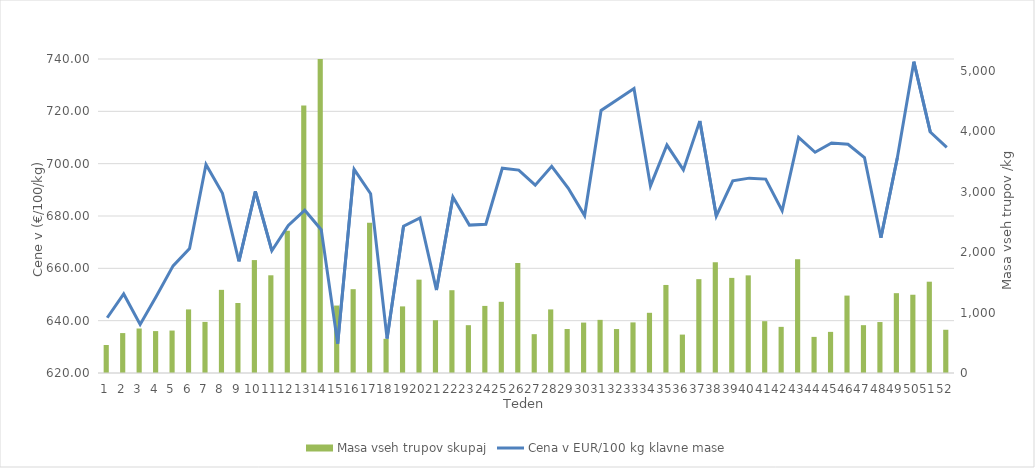
| Category | Masa vseh trupov skupaj |
|---|---|
| 0 | 464 |
| 1 | 661 |
| 2 | 737 |
| 3 | 694 |
| 4 | 703 |
| 5 | 1053 |
| 6 | 846 |
| 7 | 1377 |
| 8 | 1159 |
| 9 | 1870 |
| 10 | 1618 |
| 11 | 2355 |
| 12 | 4429 |
| 13 | 5273 |
| 14 | 1117 |
| 15 | 1388 |
| 16 | 2489 |
| 17 | 566 |
| 18 | 1103 |
| 19 | 1546 |
| 20 | 874 |
| 21 | 1371 |
| 22 | 792 |
| 23 | 1111 |
| 24 | 1179 |
| 25 | 1822 |
| 26 | 643 |
| 27 | 1053 |
| 28 | 729 |
| 29 | 835 |
| 30 | 880 |
| 31 | 728 |
| 32 | 838 |
| 33 | 997 |
| 34 | 1458 |
| 35 | 636 |
| 36 | 1554 |
| 37 | 1834 |
| 38 | 1575 |
| 39 | 1617 |
| 40 | 858 |
| 41 | 764 |
| 42 | 1884 |
| 43 | 598 |
| 44 | 681 |
| 45 | 1282 |
| 46 | 792 |
| 47 | 844 |
| 48 | 1322 |
| 49 | 1296 |
| 50 | 1512 |
| 51 | 716 |